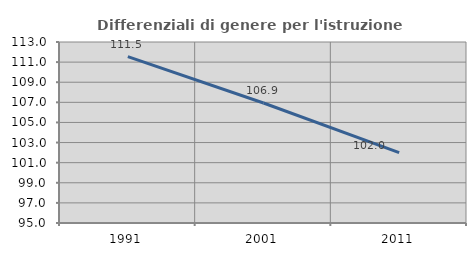
| Category | Differenziali di genere per l'istruzione superiore |
|---|---|
| 1991.0 | 111.546 |
| 2001.0 | 106.931 |
| 2011.0 | 101.996 |